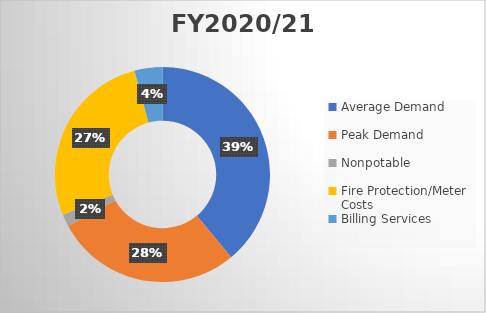
| Category | Series 0 |
|---|---|
| Average Demand | 2509397 |
| Peak Demand | 1807420 |
| Nonpotable | 118058.919 |
| Fire Protection/Meter Costs | 1734050 |
| Billing Services | 269753 |